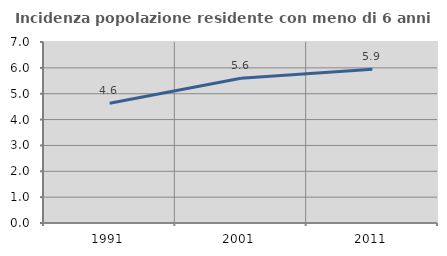
| Category | Incidenza popolazione residente con meno di 6 anni |
|---|---|
| 1991.0 | 4.63 |
| 2001.0 | 5.599 |
| 2011.0 | 5.947 |